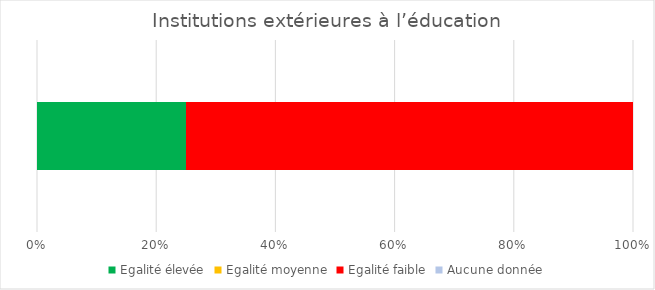
| Category | Egalité élevée | Egalité moyenne | Egalité faible | Aucune donnée |
|---|---|---|---|---|
| 0 | 1 | 0 | 3 | 0 |